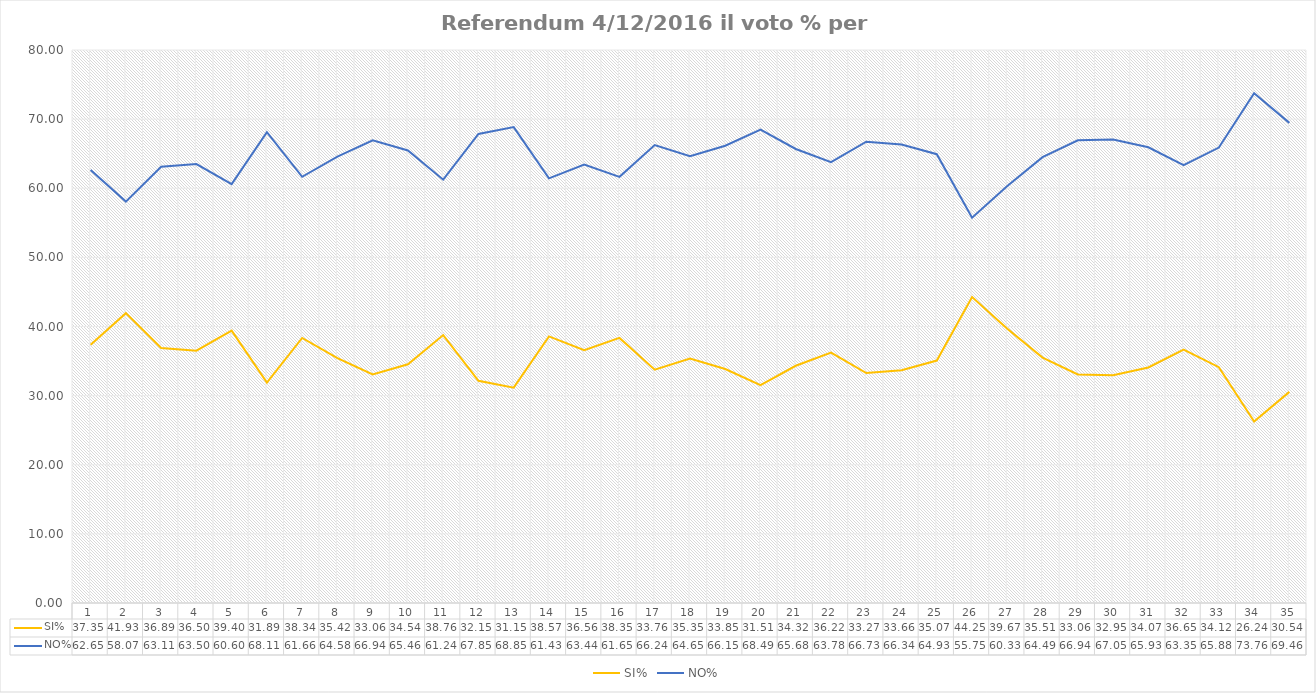
| Category | SI% | NO% |
|---|---|---|
| 1.0 | 37.349 | 62.651 |
| 2.0 | 41.929 | 58.071 |
| 3.0 | 36.893 | 63.107 |
| 4.0 | 36.496 | 63.504 |
| 5.0 | 39.4 | 60.6 |
| 6.0 | 31.886 | 68.114 |
| 7.0 | 38.341 | 61.659 |
| 8.0 | 35.421 | 64.579 |
| 9.0 | 33.06 | 66.94 |
| 10.0 | 34.535 | 65.465 |
| 11.0 | 38.758 | 61.242 |
| 12.0 | 32.15 | 67.85 |
| 13.0 | 31.155 | 68.845 |
| 14.0 | 38.569 | 61.431 |
| 15.0 | 36.557 | 63.443 |
| 16.0 | 38.353 | 61.647 |
| 17.0 | 33.76 | 66.24 |
| 18.0 | 35.354 | 64.646 |
| 19.0 | 33.851 | 66.149 |
| 20.0 | 31.51 | 68.49 |
| 21.0 | 34.317 | 65.683 |
| 22.0 | 36.224 | 63.776 |
| 23.0 | 33.273 | 66.727 |
| 24.0 | 33.663 | 66.337 |
| 25.0 | 35.075 | 64.925 |
| 26.0 | 44.252 | 55.748 |
| 27.0 | 39.666 | 60.334 |
| 28.0 | 35.51 | 64.49 |
| 29.0 | 33.055 | 66.945 |
| 30.0 | 32.945 | 67.055 |
| 31.0 | 34.069 | 65.931 |
| 32.0 | 36.648 | 63.352 |
| 33.0 | 34.118 | 65.882 |
| 34.0 | 26.244 | 73.756 |
| 35.0 | 30.544 | 69.456 |